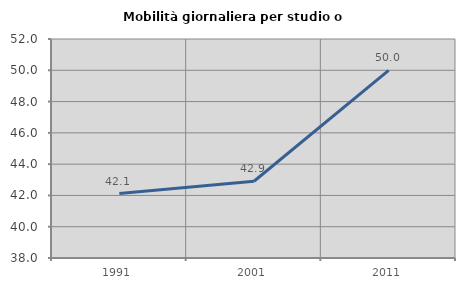
| Category | Mobilità giornaliera per studio o lavoro |
|---|---|
| 1991.0 | 42.12 |
| 2001.0 | 42.907 |
| 2011.0 | 50 |